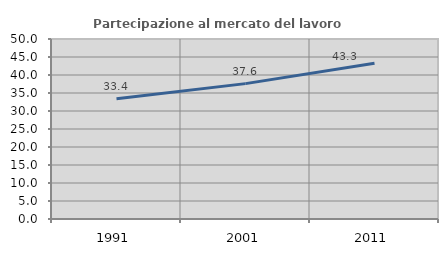
| Category | Partecipazione al mercato del lavoro  femminile |
|---|---|
| 1991.0 | 33.412 |
| 2001.0 | 37.607 |
| 2011.0 | 43.277 |